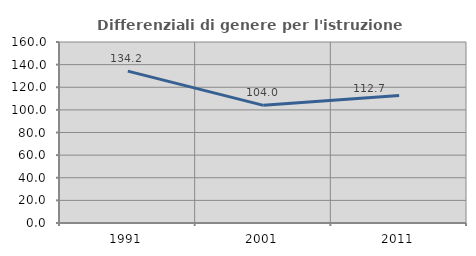
| Category | Differenziali di genere per l'istruzione superiore |
|---|---|
| 1991.0 | 134.242 |
| 2001.0 | 104.014 |
| 2011.0 | 112.734 |